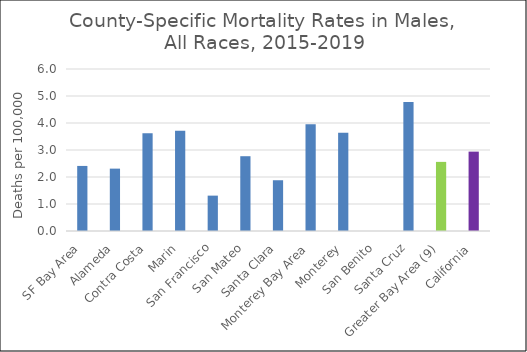
| Category | Male |
|---|---|
| SF Bay Area | 2.41 |
|   Alameda | 2.31 |
|   Contra Costa | 3.62 |
|   Marin | 3.71 |
|   San Francisco | 1.31 |
|   San Mateo | 2.77 |
|   Santa Clara | 1.88 |
| Monterey Bay Area | 3.95 |
|   Monterey | 3.64 |
|   San Benito | 0 |
|   Santa Cruz | 4.78 |
| Greater Bay Area (9) | 2.56 |
| California | 2.94 |